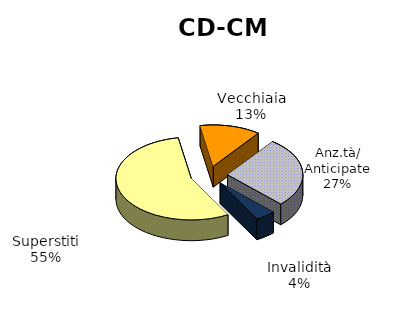
| Category | Series 0 |
|---|---|
| Vecchiaia | 4120 |
| Anz.tà/ Anticipate | 8665 |
| Invalidità | 1393 |
| Superstiti | 17565 |